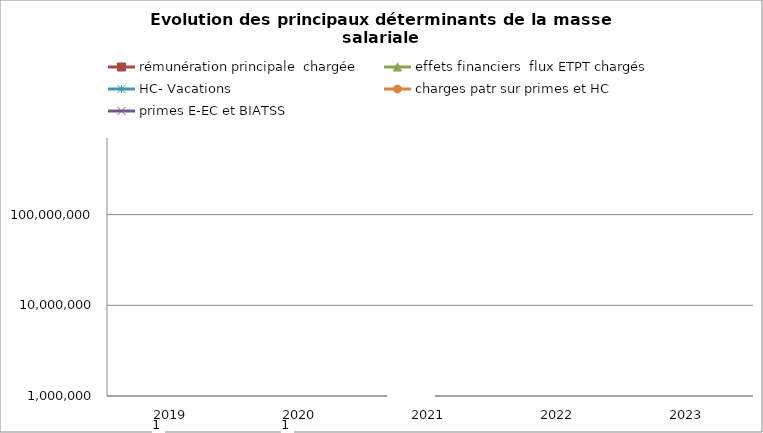
| Category | rémunération principale  chargée | effets financiers  flux ETPT chargés | HC- Vacations | charges patr sur primes et HC | primes E-EC et BIATSS |
|---|---|---|---|---|---|
| 2019.0 | 0 | 1 | 0 | 0 | 0 |
| 2020.0 | 0 | 1 | 0 | 0 | 0 |
| 2021.0 | 0 | 0 | 0 | 0 | 0 |
| 2022.0 | 0 | 0 | 0 | 0 | 0 |
| 2023.0 | 0 | 0 | 0 | 0 | 0 |